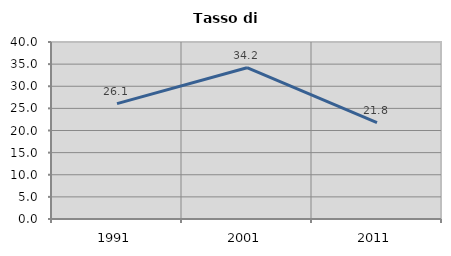
| Category | Tasso di disoccupazione   |
|---|---|
| 1991.0 | 26.072 |
| 2001.0 | 34.183 |
| 2011.0 | 21.802 |